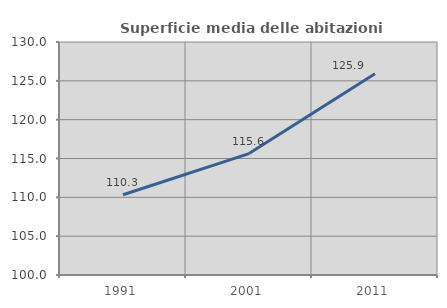
| Category | Superficie media delle abitazioni occupate |
|---|---|
| 1991.0 | 110.335 |
| 2001.0 | 115.631 |
| 2011.0 | 125.925 |